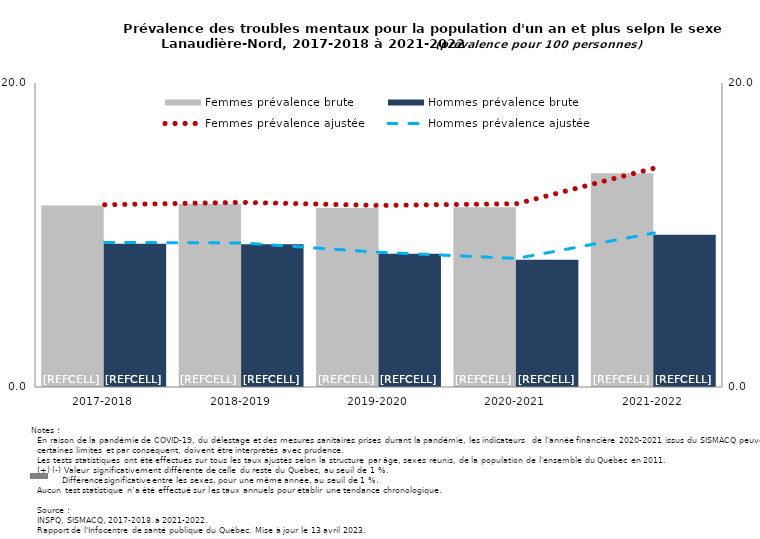
| Category | Femmes prévalence brute | Hommes prévalence brute |
|---|---|---|
| 2017-2018 | 11.939 | 9.42 |
| 2018-2019 | 12.046 | 9.391 |
| 2019-2020 | 11.782 | 8.761 |
| 2020-2021 | 11.831 | 8.379 |
| 2021-2022 | 14.062 | 10.016 |